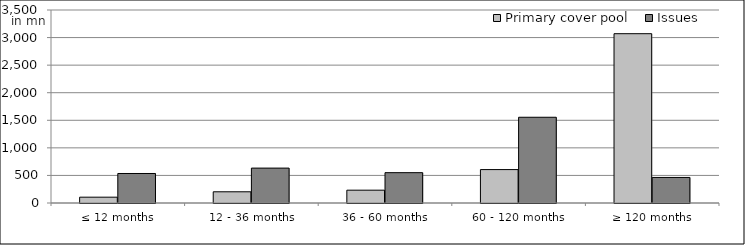
| Category | Primary cover pool | Issues |
|---|---|---|
| ≤ 12 months | 105415666.76 | 535000000 |
| 12 - 36 months | 203355804.751 | 632932113.52 |
| 36 - 60 months | 232419787.131 | 550150000 |
| 60 - 120 months | 606009903.66 | 1555000000 |
| ≥ 120 months | 3070167928.637 | 463435034.29 |